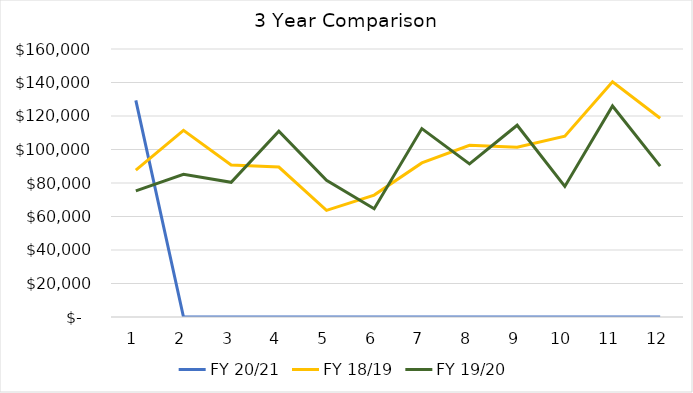
| Category | FY 20/21 | FY 18/19 | FY 19/20 |
|---|---|---|---|
| 0 | 129371 | 87719.63 | 75265.5 |
| 1 | 0 | 111397.91 | 85149.75 |
| 2 | 0 | 90707.5 | 80410.5 |
| 3 | 0 | 89498.14 | 110914.5 |
| 4 | 0 | 63690.54 | 81651.36 |
| 5 | 0 | 72767.25 | 64655.6 |
| 6 | 0 | 92009 | 112485.23 |
| 7 | 0 | 102516.96 | 91414.08 |
| 8 | 0 | 101312.5 | 114482.53 |
| 9 | 0 | 107962.5 | 77972.3 |
| 10 | 0 | 140369.25 | 125998 |
| 11 | 0 | 118626.95 | 90104 |